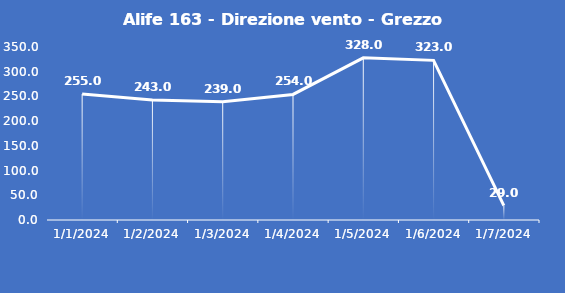
| Category | Alife 163 - Direzione vento - Grezzo (°N) |
|---|---|
| 1/1/24 | 255 |
| 1/2/24 | 243 |
| 1/3/24 | 239 |
| 1/4/24 | 254 |
| 1/5/24 | 328 |
| 1/6/24 | 323 |
| 1/7/24 | 29 |